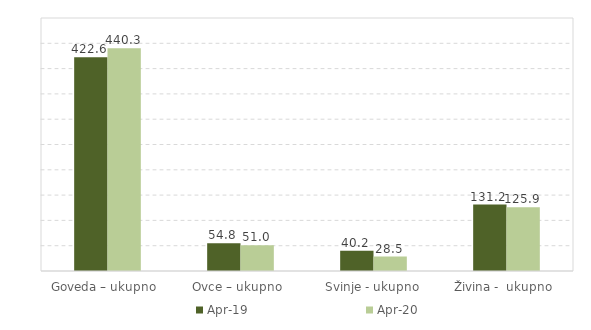
| Category | Apr-19 | Apr-20 |
|---|---|---|
| Goveda – ukupno  | 422.6 | 440.3 |
| Ovce – ukupno  | 54.8 | 51 |
| Svinje - ukupno | 40.2 | 28.5 |
| Živina -  ukupno  | 131.2 | 125.9 |